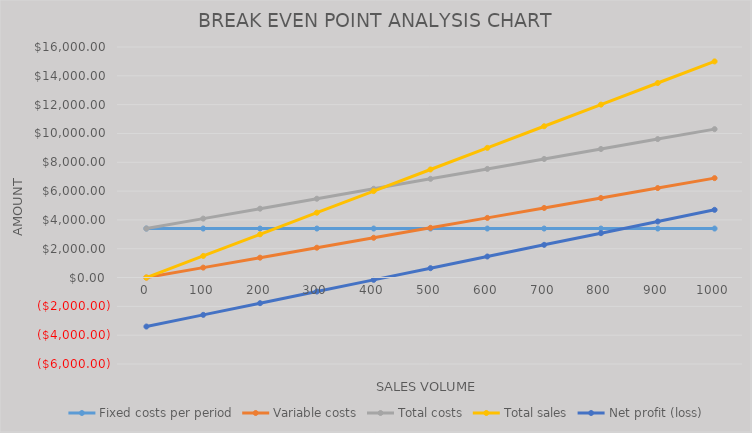
| Category | Fixed costs per period | Variable costs | Total costs | Total sales | Net profit (loss) |
|---|---|---|---|---|---|
| 0.0 | 3400 | 0 | 3400 | 0 | -3400 |
| 100.0 | 3400 | 690 | 4090 | 1500 | -2590 |
| 200.0 | 3400 | 1380 | 4780 | 3000 | -1780 |
| 300.0 | 3400 | 2070 | 5470 | 4500 | -970 |
| 400.0 | 3400 | 2760 | 6160 | 6000 | -160 |
| 500.0 | 3400 | 3450 | 6850 | 7500 | 650 |
| 600.0 | 3400 | 4140 | 7540 | 9000 | 1460 |
| 700.0 | 3400 | 4830 | 8230 | 10500 | 2270 |
| 800.0 | 3400 | 5520 | 8920 | 12000 | 3080 |
| 900.0 | 3400 | 6210 | 9610 | 13500 | 3890 |
| 1000.0 | 3400 | 6900 | 10300 | 15000 | 4700 |